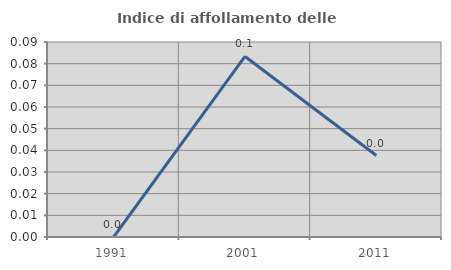
| Category | Indice di affollamento delle abitazioni  |
|---|---|
| 1991.0 | 0 |
| 2001.0 | 0.083 |
| 2011.0 | 0.038 |